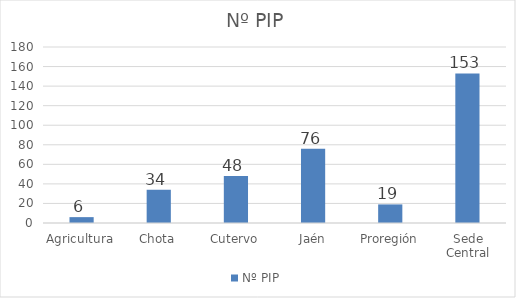
| Category | Nº PIP |
|---|---|
| Agricultura | 6 |
| Chota | 34 |
| Cutervo | 48 |
| Jaén | 76 |
| Proregión | 19 |
| Sede Central | 153 |